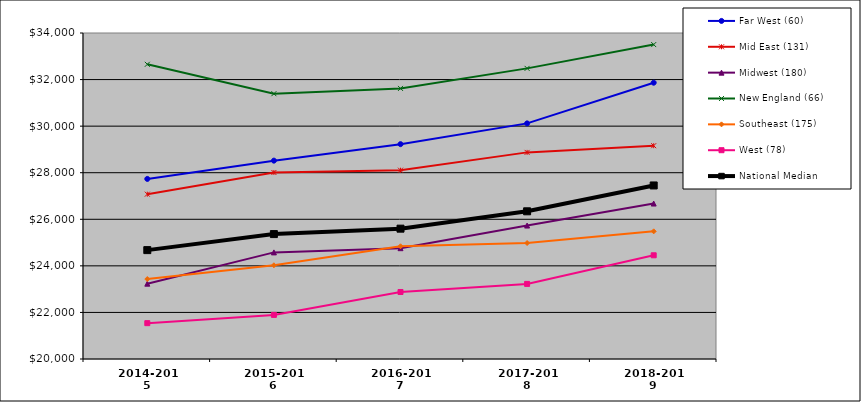
| Category | Far West (60) | Mid East (131) | Midwest (180) | New England (66) | Southeast (175) | West (78) | National Median |
|---|---|---|---|---|---|---|---|
| 2014-2015 | 27733.643 | 27078.295 | 23234.923 | 32655.51 | 23433.442 | 21538.641 | 24676.206 |
| 2015-2016 | 28517.856 | 28009.694 | 24578.051 | 31393.336 | 24024.251 | 21894.382 | 25364.205 |
| 2016-2017 | 29226.506 | 28107.715 | 24759.196 | 31619.633 | 24840.736 | 22877.336 | 25597.574 |
| 2017-2018 | 30118.347 | 28873.255 | 25730.669 | 32480.987 | 24979.773 | 23225.377 | 26342.841 |
| 2018-2019 | 31865.372 | 29160.187 | 26676.03 | 33502.193 | 25482.24 | 24453.997 | 27452.913 |